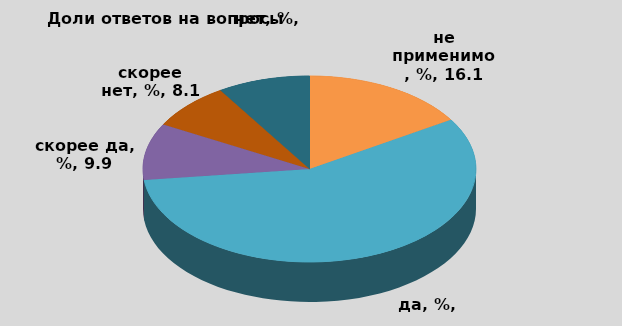
| Category | B2 |
|---|---|
| не применимо, % | 16.143 |
| да, % | 56.951 |
| скорее да, % | 9.865 |
| скорее нет, % | 8.072 |
| нет, % | 8.969 |